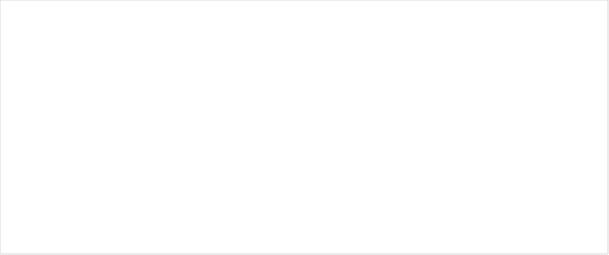
| Category | Summa |
|---|---|
| 0 | 0.702 |
| 1 | 0.182 |
| 2 | 0.116 |
| 3 | 0.726 |
| 4 | 0.239 |
| 5 | 0.034 |